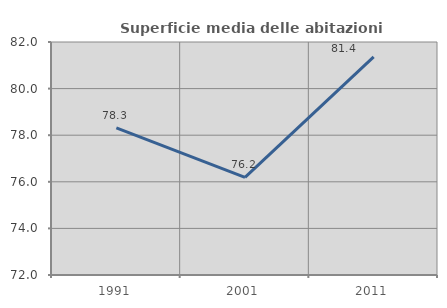
| Category | Superficie media delle abitazioni occupate |
|---|---|
| 1991.0 | 78.312 |
| 2001.0 | 76.19 |
| 2011.0 | 81.358 |